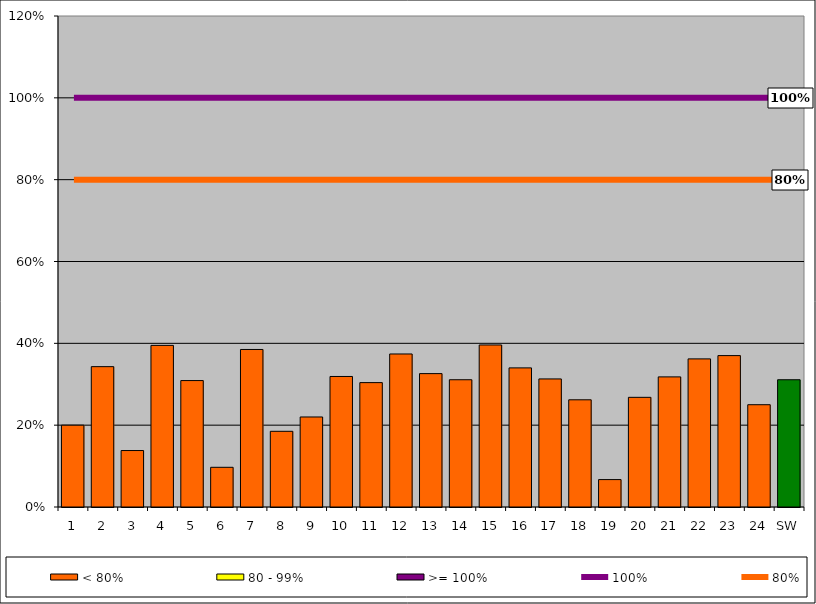
| Category | < 80% | 80 - 99% | >= 100% |
|---|---|---|---|
| 1 | 0.2 | 0 | 0 |
| 2 | 0.343 | 0 | 0 |
| 3 | 0.138 | 0 | 0 |
| 4 | 0.395 | 0 | 0 |
| 5 | 0.309 | 0 | 0 |
| 6 | 0.097 | 0 | 0 |
| 7 | 0.385 | 0 | 0 |
| 8 | 0.185 | 0 | 0 |
| 9 | 0.22 | 0 | 0 |
| 10 | 0.319 | 0 | 0 |
| 11 | 0.304 | 0 | 0 |
| 12 | 0.374 | 0 | 0 |
| 13 | 0.326 | 0 | 0 |
| 14 | 0.311 | 0 | 0 |
| 15 | 0.396 | 0 | 0 |
| 16 | 0.34 | 0 | 0 |
| 17 | 0.313 | 0 | 0 |
| 18 | 0.262 | 0 | 0 |
| 19 | 0.067 | 0 | 0 |
| 20 | 0.268 | 0 | 0 |
| 21 | 0.318 | 0 | 0 |
| 22 | 0.362 | 0 | 0 |
| 23 | 0.37 | 0 | 0 |
| 24 | 0.25 | 0 | 0 |
| SW | 0.311 | 0 | 0 |